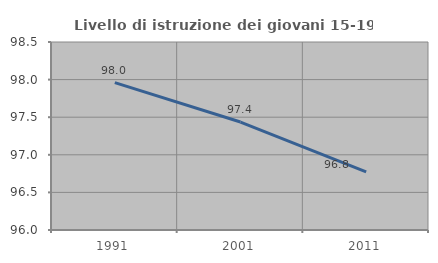
| Category | Livello di istruzione dei giovani 15-19 anni |
|---|---|
| 1991.0 | 97.959 |
| 2001.0 | 97.436 |
| 2011.0 | 96.774 |